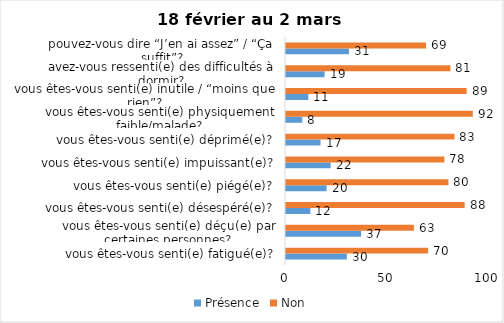
| Category | Présence | Non |
|---|---|---|
| vous êtes-vous senti(e) fatigué(e)? | 30 | 70 |
| vous êtes-vous senti(e) déçu(e) par certaines personnes? | 37 | 63 |
| vous êtes-vous senti(e) désespéré(e)? | 12 | 88 |
| vous êtes-vous senti(e) piégé(e)? | 20 | 80 |
| vous êtes-vous senti(e) impuissant(e)? | 22 | 78 |
| vous êtes-vous senti(e) déprimé(e)? | 17 | 83 |
| vous êtes-vous senti(e) physiquement faible/malade? | 8 | 92 |
| vous êtes-vous senti(e) inutile / “moins que rien”? | 11 | 89 |
| avez-vous ressenti(e) des difficultés à dormir? | 19 | 81 |
| pouvez-vous dire “J’en ai assez” / “Ça suffit”? | 31 | 69 |